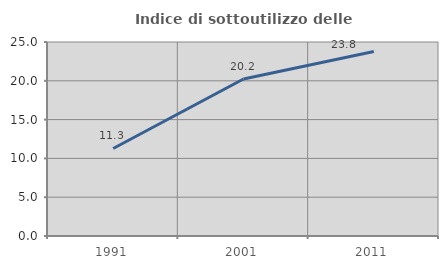
| Category | Indice di sottoutilizzo delle abitazioni  |
|---|---|
| 1991.0 | 11.279 |
| 2001.0 | 20.233 |
| 2011.0 | 23.774 |